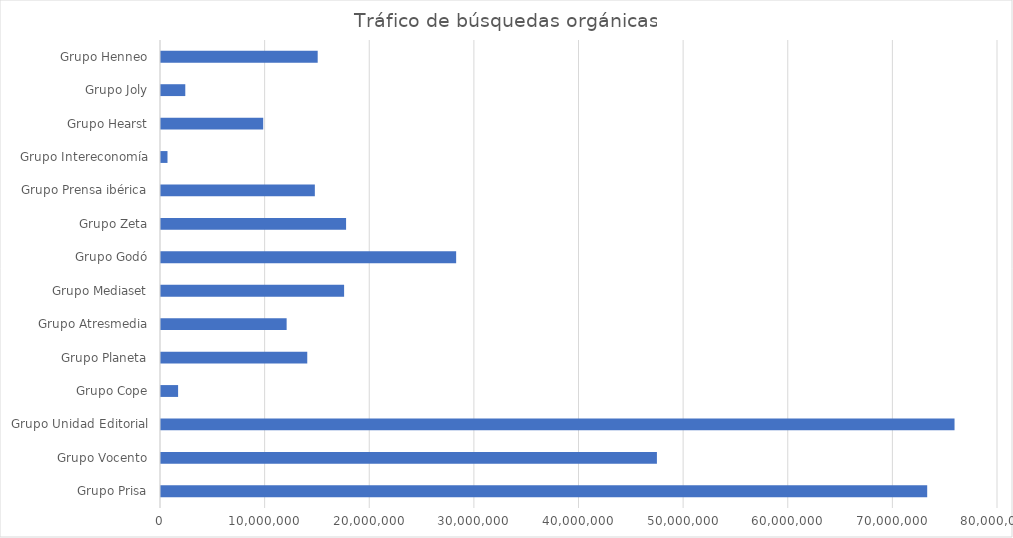
| Category | Tráfico de búsquedas orgánicas |
|---|---|
| Grupo Prisa | 73232777 |
| Grupo Vocento | 47399825 |
| Grupo Unidad Editorial | 75845830 |
| Grupo Cope | 1634100 |
| Grupo Planeta | 13979900 |
| Grupo Atresmedia | 12008500 |
| Grupo Mediaset | 17501200 |
| Grupo Godó | 28210396 |
| Grupo Zeta | 17690088 |
| Grupo Prensa ibérica | 14704800 |
| Grupo Intereconomía | 621001 |
| Grupo Hearst | 9768700 |
| Grupo Joly | 2321500 |
| Grupo Henneo | 14976300 |